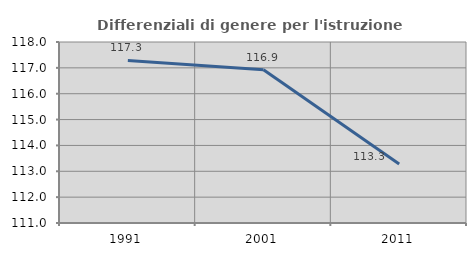
| Category | Differenziali di genere per l'istruzione superiore |
|---|---|
| 1991.0 | 117.288 |
| 2001.0 | 116.928 |
| 2011.0 | 113.282 |